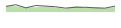
| Category | Series 1 |
|---|---|
| 0 | 187 |
| 1 | 243 |
| 2 | 139 |
| 3 | 216 |
| 4 | 197 |
| 5 | 175 |
| 6 | 130 |
| 7 | 158 |
| 8 | 158 |
| 9 | 138 |
| 10 | 129 |
| 11 | 196 |